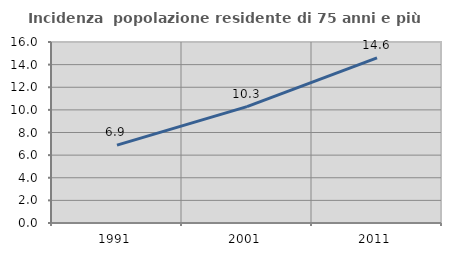
| Category | Incidenza  popolazione residente di 75 anni e più |
|---|---|
| 1991.0 | 6.888 |
| 2001.0 | 10.286 |
| 2011.0 | 14.603 |